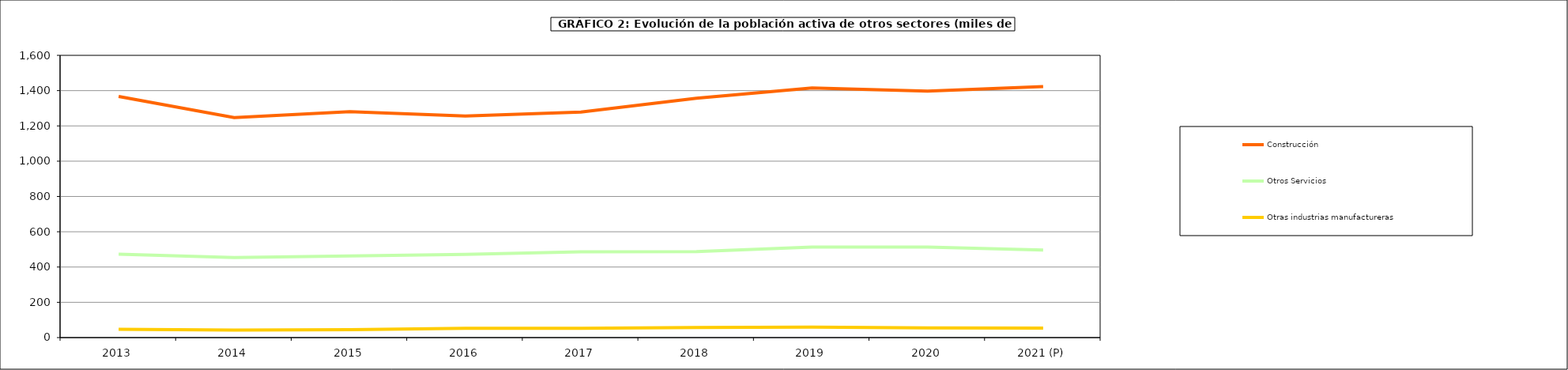
| Category | Construcción | Otros Servicios | Otras industrias manufactureras |
|---|---|---|---|
| 2013 | 1366.878 | 473.15 | 46.85 |
| 2014 | 1247.2 | 454.2 | 42.2 |
| 2015 | 1280.975 | 462.325 | 44.95 |
| 2016 | 1256.45 | 471.23 | 52.98 |
| 2017 | 1278.6 | 486.4 | 52.6 |
| 2018 | 1356.625 | 486.875 | 57 |
| 2019 | 1415.25 | 513.675 | 59.45 |
| 2020 | 1397.475 | 512.975 | 55.3 |
| 2021 (P) | 1423.3 | 496.875 | 54.1 |